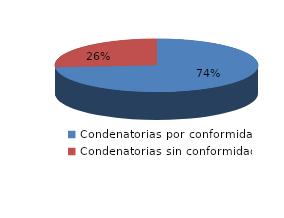
| Category | Series 0 |
|---|---|
| 0 | 3524 |
| 1 | 1248 |